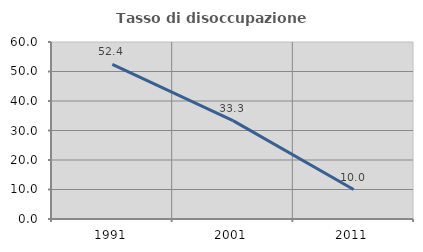
| Category | Tasso di disoccupazione giovanile  |
|---|---|
| 1991.0 | 52.381 |
| 2001.0 | 33.333 |
| 2011.0 | 10 |